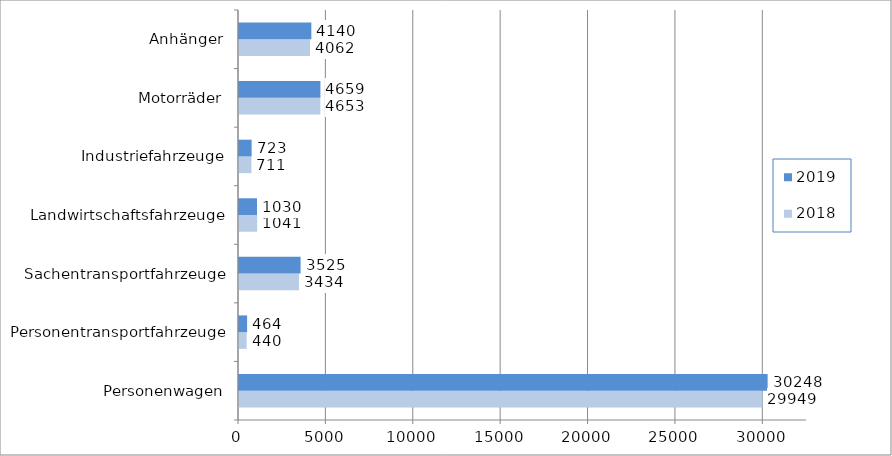
| Category | 2018 | 2019 |
|---|---|---|
| Personenwagen | 29949 | 30248 |
| Personentransportfahrzeuge | 440 | 464 |
| Sachentransportfahrzeuge | 3434 | 3525 |
| Landwirtschaftsfahrzeuge | 1041 | 1030 |
| Industriefahrzeuge | 711 | 723 |
| Motorräder | 4653 | 4659 |
| Anhänger | 4062 | 4140 |